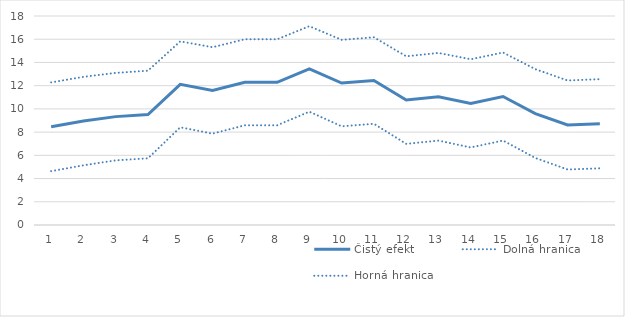
| Category | Čistý efekt | Dolná hranica | Horná hranica |
|---|---|---|---|
| 1.0 | 8.459 | 4.637 | 12.282 |
| 2.0 | 8.95 | 5.141 | 12.758 |
| 3.0 | 9.334 | 5.566 | 13.101 |
| 4.0 | 9.516 | 5.744 | 13.288 |
| 5.0 | 12.117 | 8.417 | 15.816 |
| 6.0 | 11.589 | 7.867 | 15.311 |
| 7.0 | 12.292 | 8.587 | 15.996 |
| 8.0 | 12.291 | 8.586 | 15.996 |
| 9.0 | 13.44 | 9.757 | 17.122 |
| 10.0 | 12.224 | 8.5 | 15.947 |
| 11.0 | 12.441 | 8.717 | 16.165 |
| 12.0 | 10.759 | 6.989 | 14.529 |
| 13.0 | 11.044 | 7.269 | 14.819 |
| 14.0 | 10.477 | 6.679 | 14.275 |
| 15.0 | 11.065 | 7.274 | 14.856 |
| 16.0 | 9.599 | 5.775 | 13.423 |
| 17.0 | 8.612 | 4.779 | 12.446 |
| 18.0 | 8.721 | 4.883 | 12.558 |